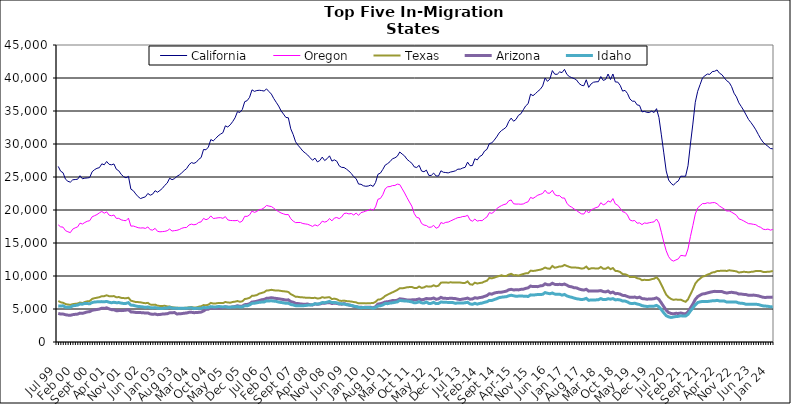
| Category |  California  |  Oregon  |  Texas  |  Arizona  |  Idaho  |
|---|---|---|---|---|---|
| Jul 99 | 26605 | 17749 | 6209 | 4339 | 5471 |
| Aug 99 | 25882 | 17447 | 6022 | 4228 | 5444 |
| Sep 99 | 25644 | 17401 | 5941 | 4237 | 5488 |
| Oct 99 | 24669 | 16875 | 5751 | 4134 | 5279 |
| Nov 99 | 24353 | 16701 | 5680 | 4073 | 5260 |
| Dec 99 | 24218 | 16570 | 5619 | 4042 | 5269 |
| Jan 00 | 24574 | 17109 | 5736 | 4142 | 5485 |
| Feb 00 | 24620 | 17295 | 5789 | 4192 | 5530 |
| Mar 00 | 24655 | 17436 | 5826 | 4226 | 5590 |
| Apr 00 | 25195 | 18009 | 5980 | 4375 | 5748 |
| May 00 | 24730 | 17875 | 5897 | 4337 | 5729 |
| Jun 00 | 24825 | 18113 | 6070 | 4444 | 5853 |
| Jul 00 | 24857 | 18294 | 6163 | 4555 | 5824 |
| Aug 00 | 24913 | 18376 | 6199 | 4603 | 5788 |
| Sep 00 | 25792 | 18971 | 6529 | 4804 | 5976 |
| Oct 00 | 26106 | 19135 | 6643 | 4870 | 6058 |
| Nov 00 | 26315 | 19306 | 6705 | 4926 | 6085 |
| Dec 00 | 26415 | 19570 | 6793 | 4991 | 6096 |
| Jan 01 | 26995 | 19781 | 6942 | 5122 | 6119 |
| Feb 01 | 26851 | 19519 | 6948 | 5089 | 6090 |
| Mar 01 | 27352 | 19720 | 7080 | 5180 | 6143 |
| Apr 01 | 26918 | 19221 | 6943 | 5020 | 6020 |
| May 01 | 26848 | 19126 | 6924 | 4899 | 5950 |
| Jun 01 | 26974 | 19241 | 6959 | 4895 | 6019 |
| Jul 01 | 26172 | 18725 | 6778 | 4737 | 5951 |
| Aug 01 | 25943 | 18736 | 6810 | 4757 | 5973 |
| Sep 01 | 25399 | 18514 | 6688 | 4753 | 5895 |
| Oct 01 | 25050 | 18415 | 6650 | 4780 | 5833 |
| Nov 01 | 24873 | 18381 | 6631 | 4826 | 5850 |
| Dec 01 | 25099 | 18765 | 6708 | 4898 | 5969 |
| Jan 02 | 23158 | 17561 | 6261 | 4560 | 5595 |
| Feb 02 | 22926 | 17573 | 6162 | 4531 | 5560 |
| Mar 02 | 22433 | 17452 | 6052 | 4481 | 5458 |
| Apr 02 | 22012 | 17314 | 6046 | 4458 | 5380 |
| May 02 | 21733 | 17267 | 6007 | 4452 | 5358 |
| Jun 02 | 21876 | 17298 | 5933 | 4444 | 5315 |
| Jul 02 | 21997 | 17209 | 5873 | 4383 | 5243 |
| Aug 02 | 22507 | 17436 | 5929 | 4407 | 5315 |
| Sep 02 | 22244 | 17010 | 5672 | 4248 | 5192 |
| Oct 02 | 22406 | 16952 | 5625 | 4191 | 5167 |
| Nov 02 | 22922 | 17223 | 5663 | 4242 | 5221 |
| Dec 02 | 22693 | 16770 | 5499 | 4142 | 5120 |
| Jan 03 | 22964 | 16694 | 5463 | 4166 | 5089 |
| Feb 03 | 23276 | 16727 | 5461 | 4226 | 5077 |
| Mar 03 | 23736 | 16766 | 5486 | 4251 | 5145 |
| Apr 03 | 24079 | 16859 | 5389 | 4289 | 5145 |
| May 03 | 24821 | 17117 | 5378 | 4415 | 5254 |
| Jun 03 | 24592 | 16812 | 5273 | 4426 | 5135 |
| Jul 03 | 24754 | 16875 | 5226 | 4466 | 5124 |
| Aug 03 | 25092 | 16922 | 5181 | 4244 | 5100 |
| Sep 03 | 25316 | 17036 | 5181 | 4279 | 5086 |
| Oct 03 | 25622 | 17228 | 5139 | 4301 | 5110 |
| Nov 03 | 25984 | 17335 | 5175 | 4362 | 5091 |
| Dec 03 | 26269 | 17350 | 5189 | 4396 | 5113 |
| Jan 04 | 26852 | 17734 | 5255 | 4492 | 5152 |
| Feb 04 | 27184 | 17860 | 5301 | 4502 | 5183 |
| Mar 04 | 27062 | 17757 | 5227 | 4443 | 5056 |
| Apr 04 | 27238 | 17840 | 5227 | 4461 | 5104 |
| May 04 | 27671 | 18113 | 5345 | 4493 | 5095 |
| Jun 04 | 27949 | 18201 | 5416 | 4532 | 5103 |
| Jul 04 | 29172 | 18727 | 5597 | 4697 | 5231 |
| Aug 04 | 29122 | 18529 | 5561 | 4945 | 5197 |
| Sep 04 | 29542 | 18678 | 5656 | 4976 | 5237 |
| Oct 04 | 30674 | 19108 | 5922 | 5188 | 5363 |
| Nov 04 | 30472 | 18716 | 5823 | 5106 | 5321 |
| Dec 04 | 30831 | 18755 | 5838 | 5135 | 5312 |
| Jan 05 | 31224 | 18823 | 5906 | 5155 | 5374 |
| Feb 05 | 31495 | 18842 | 5898 | 5168 | 5357 |
| Mar 05 | 31714 | 18738 | 5894 | 5212 | 5313 |
| Apr 05 | 32750 | 18998 | 6060 | 5340 | 5350 |
| May 05 | 32575 | 18504 | 5989 | 5269 | 5276 |
| Jun 05 | 32898 | 18414 | 5954 | 5252 | 5271 |
| Jul 05 | 33384 | 18395 | 6062 | 5322 | 5322 |
| Aug 05 | 33964 | 18381 | 6113 | 5375 | 5316 |
| Sep 05 | 34897 | 18426 | 6206 | 5493 | 5362 |
| Oct 05 | 34780 | 18132 | 6100 | 5408 | 5308 |
| Nov 05 | 35223 | 18332 | 6162 | 5434 | 5314 |
| Dec 05 | 36415 | 19047 | 6508 | 5658 | 5487 |
| Jan 06 | 36567 | 19032 | 6576 | 5688 | 5480 |
| Feb 06 | 37074 | 19257 | 6692 | 5792 | 5616 |
| Mar 06 | 38207 | 19845 | 6993 | 6052 | 5850 |
| Apr 06 | 37976 | 19637 | 7024 | 6101 | 5864 |
| May 06 | 38099 | 19781 | 7114 | 6178 | 5943 |
| Jun 06 | 38141 | 20061 | 7331 | 6276 | 6018 |
| Jul 06 | 38097 | 20111 | 7431 | 6399 | 6046 |
| Aug 06 | 38021 | 20333 | 7542 | 6450 | 6064 |
| Sep 06 | 38349 | 20686 | 7798 | 6627 | 6232 |
| Oct 06 | 37947 | 20591 | 7825 | 6647 | 6216 |
| Nov 06 | 37565 | 20526 | 7907 | 6707 | 6244 |
| Dec 06 | 36884 | 20272 | 7840 | 6648 | 6192 |
| Jan 07 | 36321 | 19984 | 7789 | 6597 | 6151 |
| Feb 07 | 35752 | 19752 | 7799 | 6554 | 6048 |
| Mar 07 | 35025 | 19547 | 7737 | 6487 | 5989 |
| Apr 07 | 34534 | 19412 | 7685 | 6430 | 5937 |
| May 07 | 34022 | 19296 | 7654 | 6353 | 5858 |
| Jun 07 | 33974 | 19318 | 7577 | 6390 | 5886 |
| Jul 07 | 32298 | 18677 | 7250 | 6117 | 5682 |
| Aug 07 | 31436 | 18322 | 7070 | 6034 | 5617 |
| Sep 07 | 30331 | 18087 | 6853 | 5847 | 5500 |
| Oct 07 | 29813 | 18108 | 6839 | 5821 | 5489 |
| Nov 07 | 29384 | 18105 | 6777 | 5769 | 5481 |
| Dec 07 | 28923 | 17949 | 6760 | 5733 | 5499 |
| Jan 08 | 28627 | 17890 | 6721 | 5732 | 5521 |
| Feb 08 | 28328 | 17834 | 6719 | 5749 | 5579 |
| Mar 08 | 27911 | 17680 | 6690 | 5650 | 5614 |
| Apr 08 | 27543 | 17512 | 6656 | 5612 | 5635 |
| May 08 | 27856 | 17754 | 6705 | 5774 | 5798 |
| Jun 08 | 27287 | 17589 | 6593 | 5717 | 5745 |
| Jul 08 | 27495 | 17834 | 6623 | 5761 | 5807 |
| Aug 08 | 28018 | 18309 | 6789 | 5867 | 5982 |
| Sep-08 | 27491 | 18164 | 6708 | 5864 | 5954 |
| Oct 08 | 27771 | 18291 | 6755 | 5942 | 6032 |
| Nov 08 | 28206 | 18706 | 6787 | 5970 | 6150 |
| Dec 08 | 27408 | 18353 | 6505 | 5832 | 5975 |
| Jan 09 | 27601 | 18778 | 6569 | 5890 | 5995 |
| Feb 09 | 27394 | 18863 | 6483 | 5845 | 5936 |
| Mar 09 | 26690 | 18694 | 6273 | 5751 | 5806 |
| Apr 09 | 26461 | 18943 | 6222 | 5735 | 5777 |
| May 09 | 26435 | 19470 | 6272 | 5819 | 5767 |
| Jun 09 | 26187 | 19522 | 6199 | 5700 | 5649 |
| Jul 09 | 25906 | 19408 | 6171 | 5603 | 5617 |
| Aug 09 | 25525 | 19469 | 6128 | 5533 | 5540 |
| Sep 09 | 25050 | 19249 | 6059 | 5405 | 5437 |
| Oct 09 | 24741 | 19529 | 6004 | 5349 | 5369 |
| Nov 09 | 23928 | 19187 | 5854 | 5271 | 5248 |
| Dec 09 | 23899 | 19607 | 5886 | 5261 | 5195 |
| Jan 10 | 23676 | 19703 | 5881 | 5232 | 5234 |
| Feb 10 | 23592 | 19845 | 5850 | 5272 | 5236 |
| Mar 10 | 23634 | 19946 | 5864 | 5278 | 5219 |
| Apr 10 | 23774 | 20134 | 5889 | 5257 | 5201 |
| May 10 | 23567 | 19966 | 5897 | 5172 | 5105 |
| Jun 10 | 24166 | 20464 | 6087 | 5356 | 5237 |
| Jul 10 | 25410 | 21627 | 6417 | 5742 | 5452 |
| Aug 10 | 25586 | 21744 | 6465 | 5797 | 5491 |
| Sep 10 | 26150 | 22314 | 6667 | 5907 | 5609 |
| Oct 10 | 26807 | 23219 | 6986 | 6070 | 5831 |
| Nov 10 | 27033 | 23520 | 7179 | 6100 | 5810 |
| Dec 10 | 27332 | 23551 | 7361 | 6182 | 5898 |
| Jan 11 | 27769 | 23697 | 7525 | 6276 | 5938 |
| Feb 11 | 27898 | 23718 | 7708 | 6267 | 6016 |
| Mar 11 | 28155 | 23921 | 7890 | 6330 | 6081 |
| Apr 11 | 28790 | 23847 | 8146 | 6544 | 6305 |
| May 11 | 28471 | 23215 | 8131 | 6502 | 6248 |
| Jun 11 | 28191 | 22580 | 8199 | 6445 | 6217 |
| Jul 11 | 27678 | 21867 | 8291 | 6368 | 6202 |
| Aug 11 | 27372 | 21203 | 8321 | 6356 | 6146 |
| Sep 11 | 27082 | 20570 | 8341 | 6387 | 6075 |
| Oct 11 | 26528 | 19442 | 8191 | 6402 | 5932 |
| Nov 11 | 26440 | 18872 | 8176 | 6426 | 5968 |
| Dec 11 | 26770 | 18784 | 8401 | 6533 | 6106 |
| Jan 12 | 25901 | 17963 | 8202 | 6390 | 5933 |
| Feb 12 | 25796 | 17718 | 8266 | 6456 | 5900 |
| Mar 12 | 26042 | 17647 | 8456 | 6600 | 6054 |
| Apr 12 | 25239 | 17386 | 8388 | 6534 | 5838 |
| May 12 | 25238 | 17407 | 8401 | 6558 | 5854 |
| Jun 12 | 25593 | 17673 | 8594 | 6669 | 6009 |
| Jul 12 | 25155 | 17237 | 8432 | 6474 | 5817 |
| Aug 12 | 25146 | 17391 | 8536 | 6539 | 5842 |
| Sep 12 | 25942 | 18102 | 8989 | 6759 | 6061 |
| Oct 12 | 25718 | 17953 | 9012 | 6618 | 6027 |
| Nov 12 | 25677 | 18134 | 9032 | 6611 | 6009 |
| Dec 12 | 25619 | 18166 | 8981 | 6601 | 5999 |
| Jan 13 | 25757 | 18344 | 9051 | 6627 | 5989 |
| Feb-13 | 25830 | 18512 | 9001 | 6606 | 5968 |
| Mar-13 | 25940 | 18689 | 9021 | 6577 | 5853 |
| Apr 13 | 26187 | 18844 | 9013 | 6478 | 5925 |
| May 13 | 26192 | 18884 | 9003 | 6431 | 5924 |
| Jun-13 | 26362 | 19013 | 8948 | 6508 | 5896 |
| Jul 13 | 26467 | 19037 | 8958 | 6559 | 5948 |
| Aug 13 | 27253 | 19198 | 9174 | 6655 | 6020 |
| Sep 13 | 26711 | 18501 | 8747 | 6489 | 5775 |
| Oct 13 | 26733 | 18301 | 8681 | 6511 | 5711 |
| Nov 13 | 27767 | 18620 | 8989 | 6709 | 5860 |
| Dec 13 | 27583 | 18320 | 8863 | 6637 | 5740 |
| Jan 14 | 28107 | 18409 | 8939 | 6735 | 5843 |
| Feb-14 | 28313 | 18383 | 8989 | 6779 | 5893 |
| Mar 14 | 28934 | 18696 | 9160 | 6918 | 6015 |
| Apr 14 | 29192 | 18946 | 9291 | 7036 | 6099 |
| May 14 | 30069 | 19603 | 9701 | 7314 | 6304 |
| Jun 14 | 30163 | 19487 | 9641 | 7252 | 6293 |
| Jul-14 | 30587 | 19754 | 9752 | 7415 | 6427 |
| Aug-14 | 31074 | 20201 | 9882 | 7499 | 6557 |
| Sep 14 | 31656 | 20459 | 9997 | 7536 | 6719 |
| Oct 14 | 32037 | 20663 | 10109 | 7555 | 6786 |
| Nov 14 | 32278 | 20825 | 9992 | 7628 | 6831 |
| Dec 14 | 32578 | 20918 | 10006 | 7705 | 6860 |
| Jan 15 | 33414 | 21396 | 10213 | 7906 | 7000 |
| Feb 15 | 33922 | 21518 | 10337 | 7982 | 7083 |
| Mar 15 | 33447 | 20942 | 10122 | 7891 | 7006 |
| Apr-15 | 33731 | 20893 | 10138 | 7906 | 6931 |
| May 15 | 34343 | 20902 | 10053 | 7895 | 6952 |
| Jun-15 | 34572 | 20870 | 10192 | 7973 | 6966 |
| Jul 15 | 35185 | 20916 | 10303 | 8000 | 6949 |
| Aug 15 | 35780 | 21115 | 10399 | 8126 | 6938 |
| Sep 15 | 36109 | 21246 | 10428 | 8207 | 6896 |
| Oct 15 | 37555 | 21908 | 10813 | 8477 | 7140 |
| Nov 15 | 37319 | 21750 | 10763 | 8390 | 7112 |
| Dec 15 | 37624 | 21990 | 10807 | 8395 | 7149 |
| Jan 16 | 37978 | 22248 | 10892 | 8388 | 7201 |
| Feb 16 | 38285 | 22369 | 10951 | 8508 | 7192 |
| Mar 16 | 38792 | 22506 | 11075 | 8547 | 7226 |
| Apr 16 | 39994 | 22999 | 11286 | 8815 | 7487 |
| May 16 | 39488 | 22548 | 11132 | 8673 | 7382 |
| Jun 16 | 39864 | 22556 | 11100 | 8682 | 7315 |
| Jul 16 | 41123 | 22989 | 11516 | 8903 | 7420 |
| Aug 16 | 40573 | 22333 | 11251 | 8731 | 7261 |
| Sep 16 | 40560 | 22162 | 11340 | 8692 | 7216 |
| Oct 16 | 40923 | 22172 | 11456 | 8742 | 7233 |
| Nov 16 | 40817 | 21818 | 11459 | 8685 | 7101 |
| Dec 16 | 41311 | 21815 | 11681 | 8783 | 7203 |
| Jan 17 | 40543 | 21029 | 11524 | 8609 | 6982 |
| Feb 17 | 40218 | 20613 | 11385 | 8416 | 6852 |
| Mar 17 | 40052 | 20425 | 11276 | 8354 | 6775 |
| Apr 17 | 39913 | 20147 | 11297 | 8218 | 6653 |
| May 17 | 39695 | 19910 | 11265 | 8196 | 6552 |
| Jun 17 | 39177 | 19650 | 11225 | 8034 | 6500 |
| Jul 17 | 38901 | 19419 | 11115 | 7923 | 6429 |
| Aug 17 | 38827 | 19389 | 11168 | 7867 | 6479 |
| Sep 17 | 39736 | 19936 | 11426 | 7991 | 6609 |
| Oct 17 | 38576 | 19547 | 11041 | 7708 | 6315 |
| Nov 17 | 39108 | 20013 | 11158 | 7746 | 6381 |
| Dec 17 | 39359 | 20202 | 11185 | 7743 | 6366 |
| Jan 18 | 39420 | 20362 | 11118 | 7736 | 6380 |
| Feb 18 | 39440 | 20476 | 11128 | 7741 | 6407 |
| Mar 18 | 40218 | 21106 | 11362 | 7789 | 6578 |
| Apr 18 | 39637 | 20788 | 11111 | 7642 | 6423 |
| May 18 | 39777 | 20933 | 11097 | 7591 | 6430 |
| Jun 18 | 40602 | 21381 | 11317 | 7721 | 6554 |
| Jul 18 | 39767 | 21189 | 11038 | 7445 | 6489 |
| Aug 18 | 40608 | 21729 | 11200 | 7560 | 6569 |
| Sep 18 | 39395 | 20916 | 10772 | 7318 | 6383 |
| Oct 18 | 39383 | 20724 | 10740 | 7344 | 6429 |
| Nov 18 | 38891 | 20265 | 10605 | 7255 | 6365 |
| Dec 18 | 38013 | 19741 | 10292 | 7069 | 6205 |
| Jan 19 | 38130 | 19643 | 10261 | 7032 | 6203 |
| Feb 19 | 37658 | 19237 | 10132 | 6892 | 6073 |
| Mar 19 | 36831 | 18492 | 9848 | 6766 | 5863 |
| Apr 19 | 36492 | 18349 | 9839 | 6763 | 5827 |
| May 19 | 36481 | 18407 | 9867 | 6809 | 5873 |
| Jun 19 | 35925 | 17998 | 9661 | 6698 | 5761 |
| Jul 19 | 35843 | 18049 | 9598 | 6800 | 5673 |
| Aug 19 | 34870 | 17785 | 9361 | 6577 | 5512 |
| Sep 19 | 34945 | 18038 | 9428 | 6547 | 5437 |
| Oct 19 | 34802 | 17977 | 9385 | 6483 | 5390 |
| Nov 19 | 34775 | 18072 | 9403 | 6511 | 5401 |
| Dec 19 | 34976 | 18140 | 9518 | 6521 | 5419 |
| Jan 20 | 34774 | 18209 | 9594 | 6561 | 5434 |
| Feb 20 | 35352 | 18632 | 9804 | 6682 | 5543 |
| Mar 20 | 34013 | 18041 | 9411 | 6464 | 5330 |
| Apr 20 | 31385 | 16629 | 8666 | 5922 | 4906 |
| May 20 | 28657 | 15123 | 7927 | 5355 | 4419 |
| Jun 20 | 25915 | 13817 | 7164 | 4815 | 3992 |
| Jul 20 | 24545 | 12926 | 6776 | 4457 | 3810 |
| Aug 20 | 24048 | 12443 | 6521 | 4326 | 3720 |
| Sep 20 | 23756 | 12258 | 6386 | 4266 | 3784 |
| Oct 20 | 24166 | 12429 | 6452 | 4347 | 3861 |
| Nov 20 | 24404 | 12597 | 6386 | 4324 | 3883 |
| Dec 20 | 25120 | 13122 | 6420 | 4394 | 3974 |
| Jan 21 | 25111 | 13080 | 6236 | 4304 | 3924 |
| Feb 21 | 25114 | 13015 | 6094 | 4260 | 3930 |
| Mar 21 | 26701 | 14096 | 6455 | 4567 | 4185 |
| Apr 21 | 29998 | 15978 | 7222 | 5164 | 4697 |
| May 21 | 33020 | 17641 | 7969 | 5748 | 5148 |
| Jun 21 | 36320 | 19369 | 8840 | 6450 | 5628 |
| Jul 21 | 37989 | 20320 | 9306 | 6877 | 5984 |
| Aug 21 | 39007 | 20657 | 9615 | 7094 | 6084 |
| Sep 21 | 40023 | 20974 | 9914 | 7277 | 6151 |
| Oct 21 | 40348 | 20966 | 10003 | 7327 | 6140 |
| Nov 21 | 40599 | 21096 | 10203 | 7437 | 6136 |
| Dec 21 | 40548 | 21032 | 10328 | 7532 | 6183 |
| Jan 22 | 40967 | 21106 | 10535 | 7618 | 6237 |
| Feb 22 | 41019 | 21125 | 10579 | 7673 | 6236 |
| Mar 22 | 41220 | 20949 | 10751 | 7660 | 6310 |
| Apr 22 | 40730 | 20602 | 10772 | 7661 | 6221 |
| May 22 | 40504 | 20370 | 10792 | 7636 | 6210 |
| Jun 22 | 40013 | 20127 | 10802 | 7504 | 6199 |
| Jul 22 | 39582 | 19846 | 10761 | 7419 | 6050 |
| Aug 22 | 39321 | 19865 | 10868 | 7487 | 6071 |
| Sep 22 | 38685 | 19666 | 10811 | 7536 | 6074 |
| Oct 22 | 37700 | 19450 | 10764 | 7469 | 6042 |
| Nov 22 | 37133 | 19198 | 10701 | 7425 | 6042 |
| Dec 22 | 36232 | 18659 | 10527 | 7261 | 5898 |
| Jan 23 | 35674 | 18528 | 10578 | 7263 | 5879 |
| Feb 23 | 35072 | 18344 | 10642 | 7211 | 5827 |
| Mar 23 | 34396 | 18133 | 10609 | 7183 | 5713 |
| Apr 23 | 33708 | 17931 | 10559 | 7074 | 5706 |
| May 23 | 33245 | 17904 | 10624 | 7091 | 5712 |
| Jun 23 | 32727 | 17831 | 10663 | 7105 | 5726 |
| Jul 23 | 32148 | 17773 | 10760 | 7058 | 5719 |
| Aug 23 | 31461 | 17513 | 10759 | 6999 | 5681 |
| Sep 23 | 30794 | 17376 | 10754 | 6882 | 5566 |
| Oct 23 | 30268 | 17096 | 10620 | 6775 | 5477 |
| Nov 23 | 29929 | 17029 | 10602 | 6746 | 5443 |
| Dec 23 | 29649 | 17114 | 10651 | 6787 | 5409 |
| Jan 24 | 29317 | 16951 | 10667 | 6765 | 5333 |
| Feb 24 | 29270 | 17045 | 10763 | 6813 | 5315 |